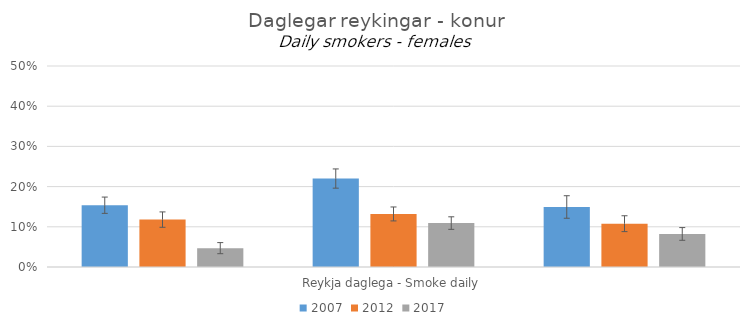
| Category | 2007 | 2012 | 2017 |
|---|---|---|---|
| 0 | 0.154 | 0.118 | 0.047 |
| 1 | 0.22 | 0.132 | 0.109 |
| 2 | 0.149 | 0.108 | 0.082 |